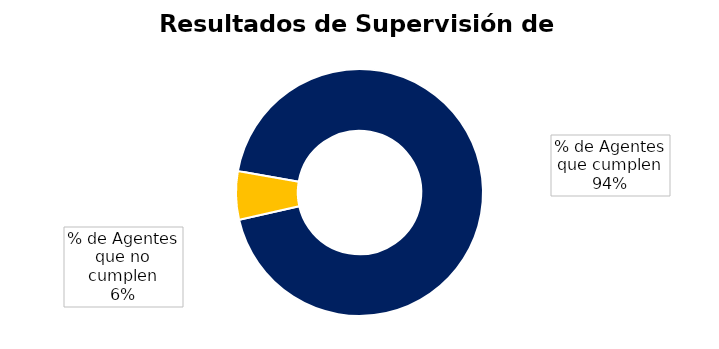
| Category | Cuenta de Departamento |
|---|---|
| % de Agentes que cumplen | 74 |
| % de Agentes que no cumplen | 5 |